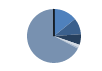
| Category | Series 0 |
|---|---|
| ARRASTRE | 116 |
| CERCO | 80 |
| PALANGRE | 52 |
| REDES DE ENMALLE | 13 |
| ARTES FIJAS | 7 |
| ARTES MENORES | 550 |
| SIN TIPO ASIGNADO | 1 |